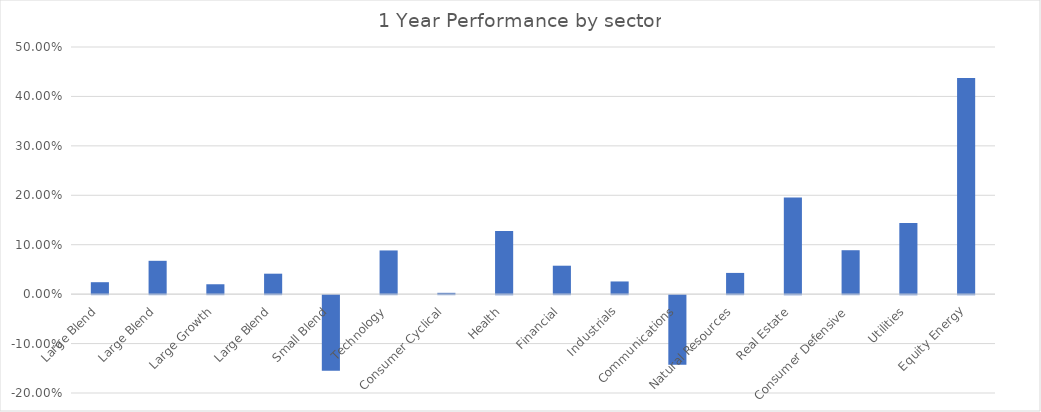
| Category | Series 0 |
|---|---|
| Large Blend | 0.024 |
| Large Blend | 0.067 |
| Large Growth | 0.02 |
| Large Blend | 0.041 |
| Small Blend | -0.153 |
| Technology | 0.088 |
| Consumer Cyclical | 0.003 |
| Health | 0.128 |
| Financial | 0.058 |
| Industrials | 0.026 |
| Communications | -0.141 |
| Natural Resources | 0.043 |
| Real Estate | 0.195 |
| Consumer Defensive | 0.089 |
| Utilities | 0.144 |
| Equity Energy | 0.438 |